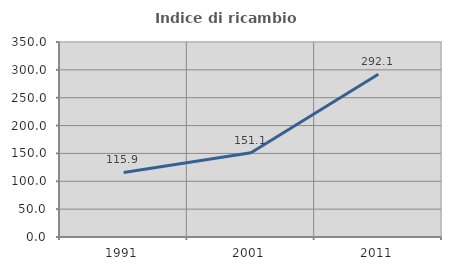
| Category | Indice di ricambio occupazionale  |
|---|---|
| 1991.0 | 115.857 |
| 2001.0 | 151.097 |
| 2011.0 | 292.079 |